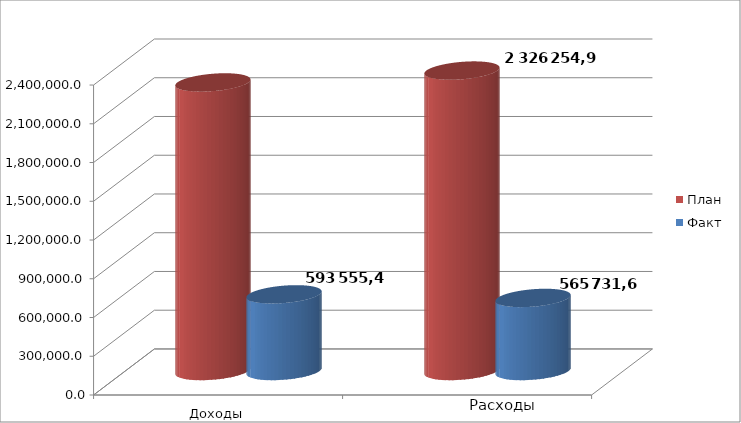
| Category | План | Факт |
|---|---|---|
| 0 | 2234275.3 | 593555.5 |
| 1 | 2326254.9 | 565731.6 |